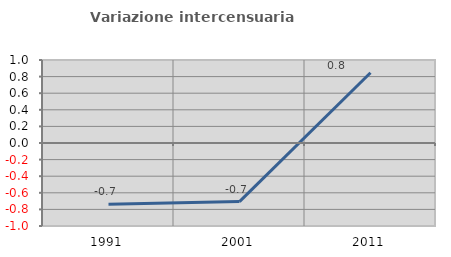
| Category | Variazione intercensuaria annua |
|---|---|
| 1991.0 | -0.738 |
| 2001.0 | -0.706 |
| 2011.0 | 0.846 |